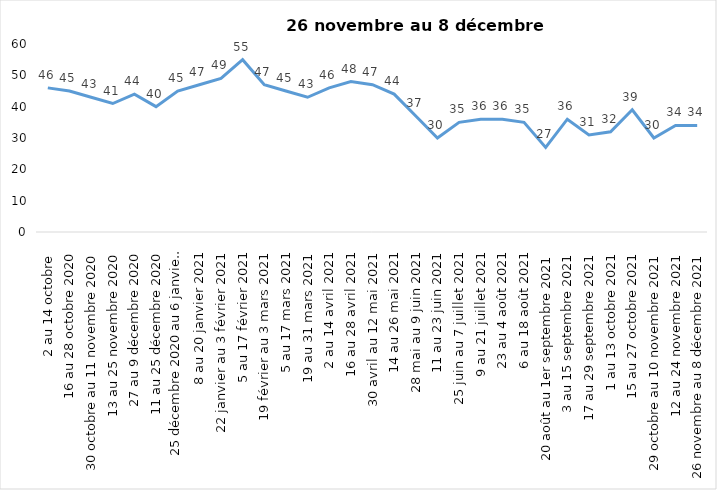
| Category | Toujours aux trois mesures |
|---|---|
| 2 au 14 octobre  | 46 |
| 16 au 28 octobre 2020 | 45 |
| 30 octobre au 11 novembre 2020 | 43 |
| 13 au 25 novembre 2020 | 41 |
| 27 au 9 décembre 2020 | 44 |
| 11 au 25 décembre 2020 | 40 |
| 25 décembre 2020 au 6 janvier 2021 | 45 |
| 8 au 20 janvier 2021 | 47 |
| 22 janvier au 3 février 2021 | 49 |
| 5 au 17 février 2021 | 55 |
| 19 février au 3 mars 2021 | 47 |
| 5 au 17 mars 2021 | 45 |
| 19 au 31 mars 2021 | 43 |
| 2 au 14 avril 2021 | 46 |
| 16 au 28 avril 2021 | 48 |
| 30 avril au 12 mai 2021 | 47 |
| 14 au 26 mai 2021 | 44 |
| 28 mai au 9 juin 2021 | 37 |
| 11 au 23 juin 2021 | 30 |
| 25 juin au 7 juillet 2021 | 35 |
| 9 au 21 juillet 2021 | 36 |
| 23 au 4 août 2021 | 36 |
| 6 au 18 août 2021 | 35 |
| 20 août au 1er septembre 2021 | 27 |
| 3 au 15 septembre 2021 | 36 |
| 17 au 29 septembre 2021 | 31 |
| 1 au 13 octobre 2021 | 32 |
| 15 au 27 octobre 2021 | 39 |
| 29 octobre au 10 novembre 2021 | 30 |
| 12 au 24 novembre 2021 | 34 |
| 26 novembre au 8 décembre 2021 | 34 |